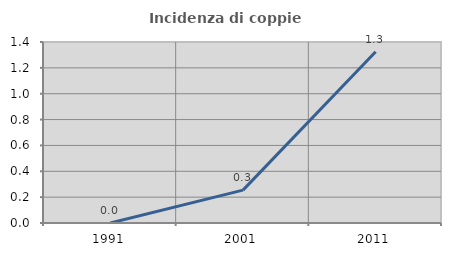
| Category | Incidenza di coppie miste |
|---|---|
| 1991.0 | 0 |
| 2001.0 | 0.254 |
| 2011.0 | 1.325 |